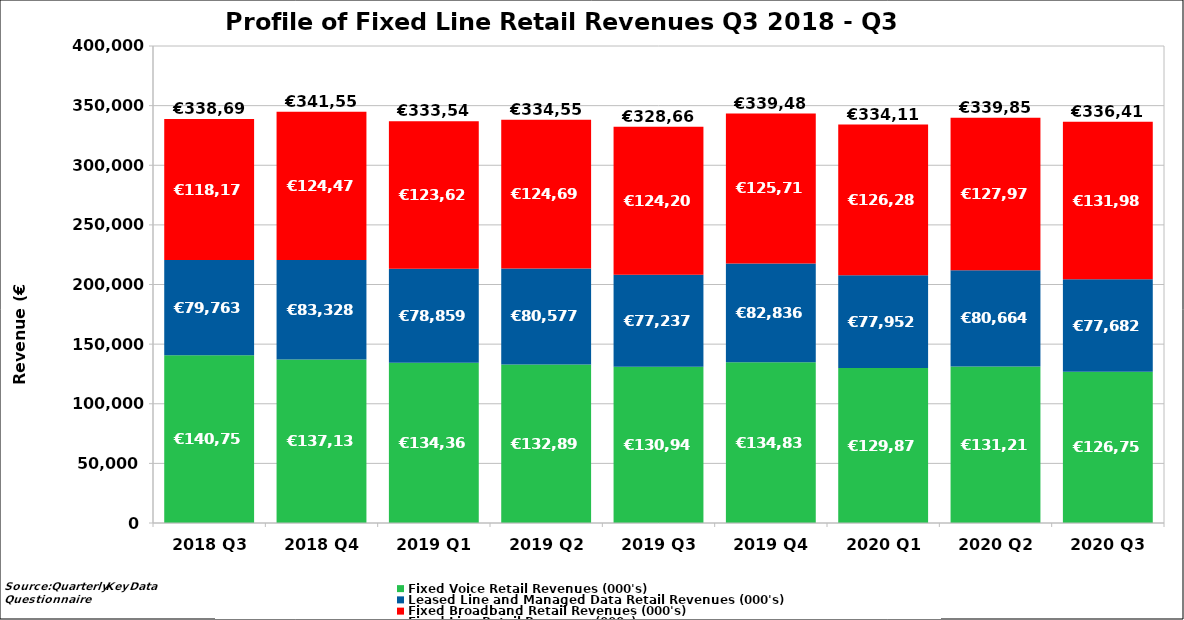
| Category | Fixed Voice Retail Revenues (000's) | Leased Line and Managed Data Retail Revenues (000's) | Fixed Broadband Retail Revenues (000's) | Fixed Line Retail Revenues (000s) |
|---|---|---|---|---|
| 2018 Q3 | 140759.241 | 79762.582 | 118170.541 | 338692.364 |
| 2018 Q4 | 137137.479 | 83327.973 | 124477.784 | 341555.412 |
| 2019 Q1 | 134363.642 | 78859.119 | 123629.125 | 333546.469 |
| 2019 Q2 | 132889.679 | 80576.923 | 124694.585 | 334555.661 |
| 2019 Q3 | 130946.24 | 77236.7 | 124204.439 | 328666.506 |
| 2019 Q4 | 134837.825 | 82836.465 | 125716.694 | 339487.178 |
| 2020 Q1 | 129879.079 | 77952.335 | 126285 | 334116.414 |
| 2020 Q2 | 131214.407 | 80663.523 | 127977 | 339854.93 |
| 2020 Q3 | 126751.235 | 77682.016 | 131985 | 336418.251 |